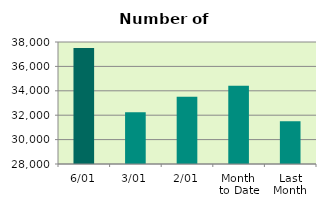
| Category | Series 0 |
|---|---|
| 6/01 | 37498 |
| 3/01 | 32252 |
| 2/01 | 33516 |
| Month 
to Date | 34422 |
| Last
Month | 31497.9 |